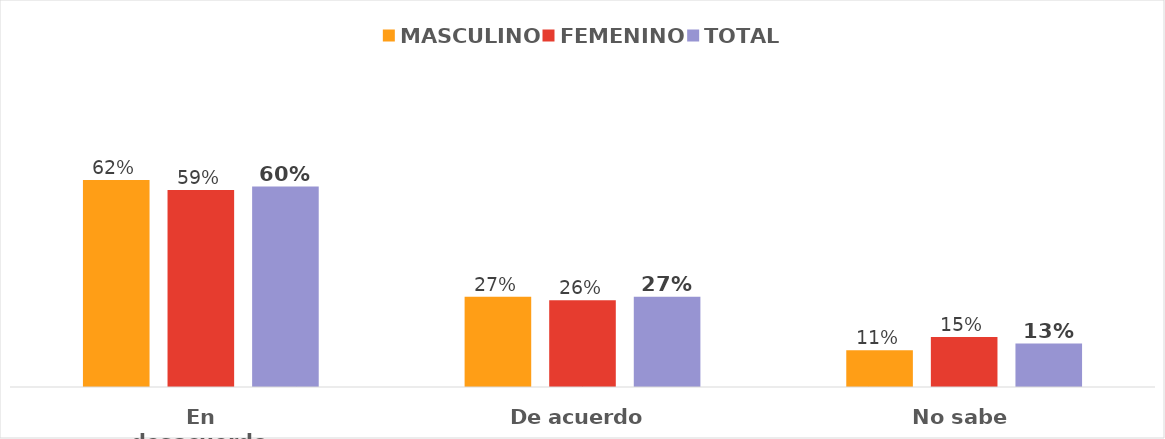
| Category | MASCULINO | FEMENINO | TOTAL |
|---|---|---|---|
| En desacuerdo | 0.62 | 0.59 | 0.6 |
| De acuerdo | 0.27 | 0.26 | 0.27 |
| No sabe | 0.11 | 0.15 | 0.13 |